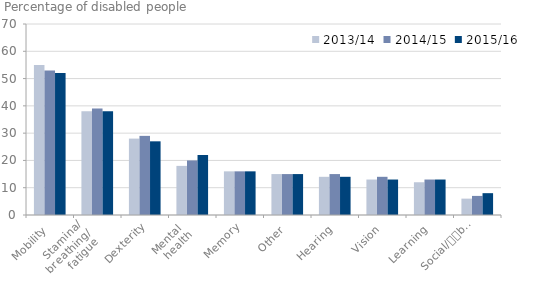
| Category | 2013/14 | 2014/15 | 2015/16 |
|---|---|---|---|
| Mobility | 55 | 53 | 52 |
| Stamina/
breathing/
fatigue | 38 | 39 | 38 |
| Dexterity | 28 | 29 | 27 |
| Mental 
health | 18 | 20 | 22 |
| Memory | 16 | 16 | 16 |
| Other | 15 | 15 | 15 |
| Hearing | 14 | 15 | 14 |
| Vision | 13 | 14 | 13 |
| Learning | 12 | 13 | 13 |
| Social/
behavioural | 6 | 7 | 8 |